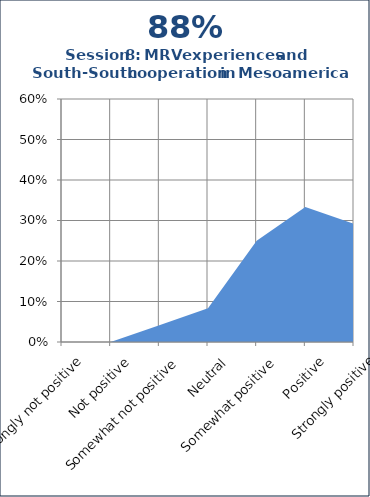
| Category | Series 1 |
|---|---|
| Strongly not positive | 0 |
| Not positive | 0 |
| Somewhat not positive | 0.042 |
| Neutral | 0.083 |
| Somewhat positive | 0.25 |
| Positive | 0.333 |
| Strongly positive | 0.292 |